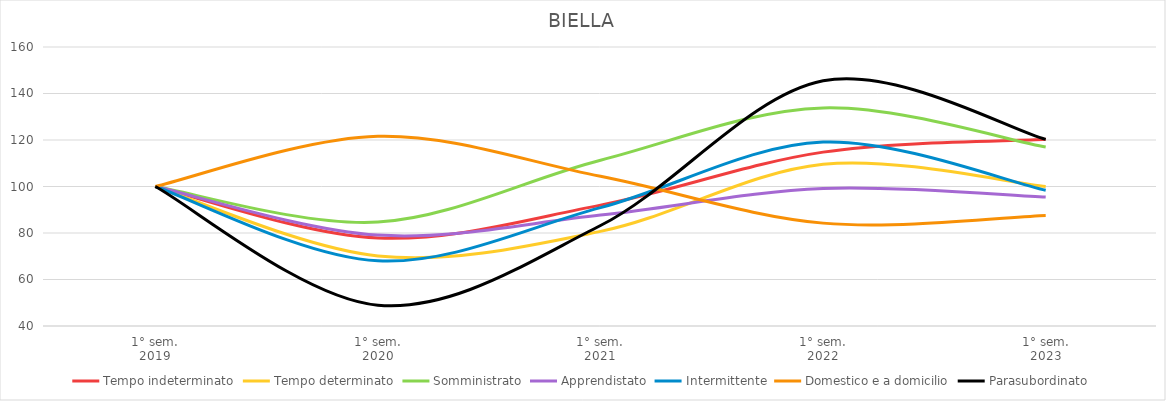
| Category | Tempo indeterminato | Tempo determinato | Somministrato | Apprendistato | Intermittente | Domestico e a domicilio | Parasubordinato |
|---|---|---|---|---|---|---|---|
| 1° sem.
2019 | 100 | 100 | 100 | 100 | 100 | 100 | 100 |
| 1° sem.
2020 | 77.833 | 70.149 | 84.69 | 79.098 | 68.015 | 121.612 | 48.951 |
| 1° sem.
2021 | 91.995 | 80.69 | 111.31 | 87.705 | 90.898 | 104.396 | 83.217 |
| 1° sem.
2022 | 114.778 | 109.56 | 133.793 | 99.18 | 119.09 | 84.249 | 145.455 |
| 1° sem.
2023 | 120.32 | 100 | 116.966 | 95.492 | 98.357 | 87.546 | 120.28 |